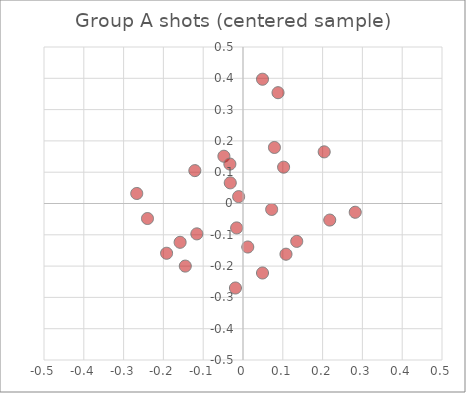
| Category | Series 0 |
|---|---|
| -0.019000000000000128 | -0.27 |
| 0.21799999999999997 | -0.053 |
| -0.04800000000000004 | 0.151 |
| -0.03200000000000003 | 0.066 |
| -0.121 | 0.105 |
| 0.28200000000000003 | -0.028 |
| 0.04899999999999993 | 0.397 |
| 0.1080000000000001 | -0.162 |
| 0.04899999999999993 | -0.222 |
| 0.01200000000000001 | -0.139 |
| -0.010999999999999677 | 0.022 |
| -0.2669999999999999 | 0.032 |
| -0.19199999999999973 | -0.159 |
| -0.11599999999999966 | -0.097 |
| 0.08800000000000008 | 0.354 |
| -0.14499999999999957 | -0.2 |
| -0.2400000000000002 | -0.048 |
| -0.03300000000000036 | 0.126 |
| 0.07899999999999974 | 0.179 |
| 0.20399999999999974 | 0.165 |
| 0.1349999999999998 | -0.121 |
| 0.07200000000000006 | -0.019 |
| 0.10200000000000031 | 0.116 |
| -0.016000000000000014 | -0.078 |
| -0.15800000000000036 | -0.124 |